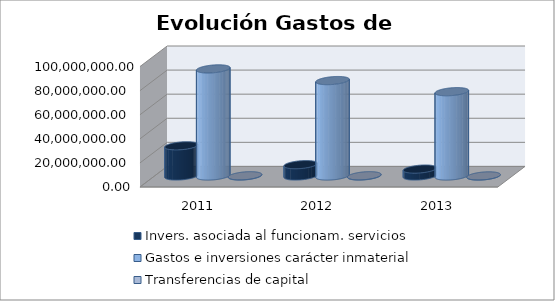
| Category | Invers. asociada al funcionam. servicios | Gastos e inversiones carácter inmaterial | Transferencias de capital |
|---|---|---|---|
| 2011.0 | 25073029.66 | 88936694.21 | 188327.53 |
| 2012.0 | 9429520.54 | 79237322.47 | 200037.96 |
| 2013.0 | 5748750.06 | 70016050.68 | 72811.4 |